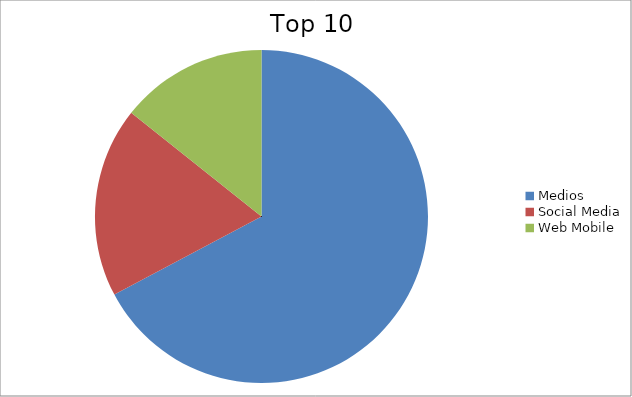
| Category | Series 0 |
|---|---|
| Medios | 67.24 |
| Social Media | 18.46 |
| Web Mobile | 14.3 |